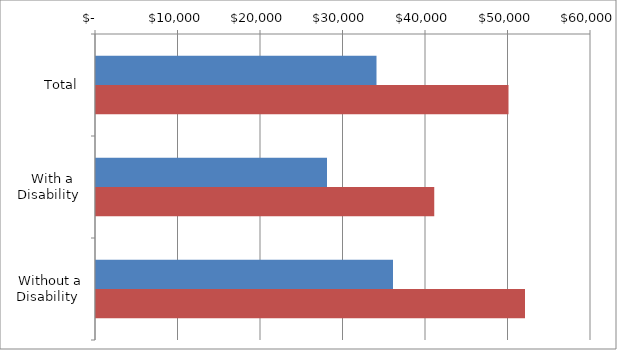
| Category | Series 0 | Series 1 |
|---|---|---|
| Total | 34000 | 50000 |
|  With a Disability  | 28000 | 41000 |
|  Without a Disability  | 36000 | 52000 |